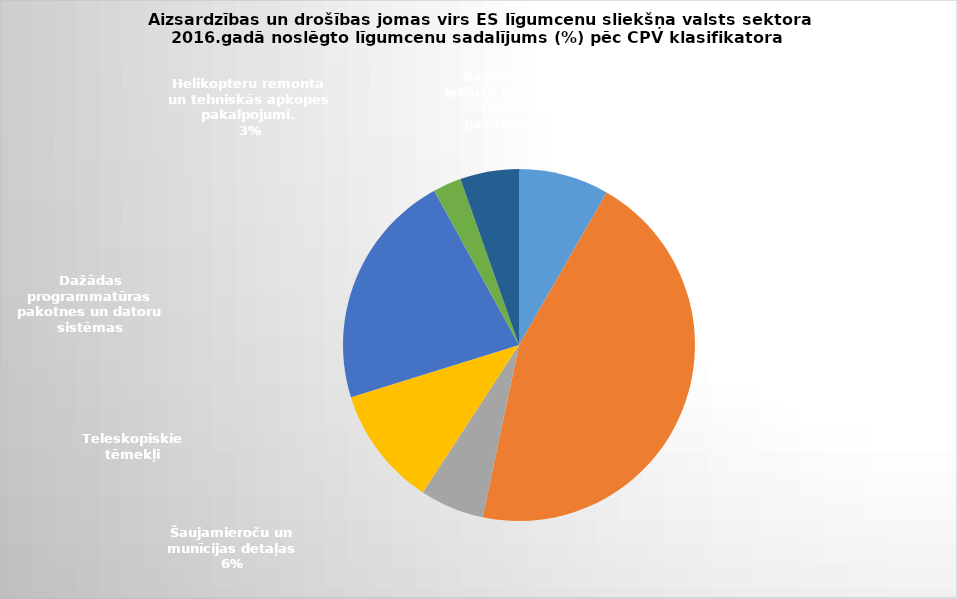
| Category | Series 0 |
|---|---|
| 0 | 0.083 |
| 1 | 0.45 |
| 2 | 0.059 |
| 3 | 0.11 |
| 4 | 0.218 |
| 5 | 0.026 |
| 6 | 0.054 |